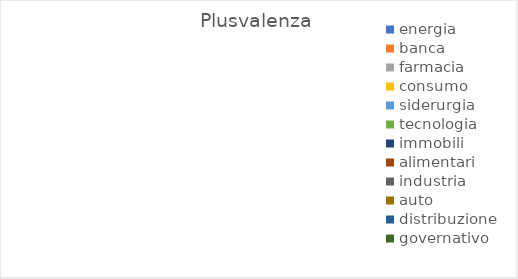
| Category | Plusvalenza |
|---|---|
| energia | 0 |
| banca | 0 |
| farmacia | 0 |
| consumo | 0 |
| siderurgia | 0 |
| tecnologia | 0 |
| immobili | 0 |
| alimentari | 0 |
| industria | 0 |
| auto | 0 |
| distribuzione | 0 |
| governativo | 0 |